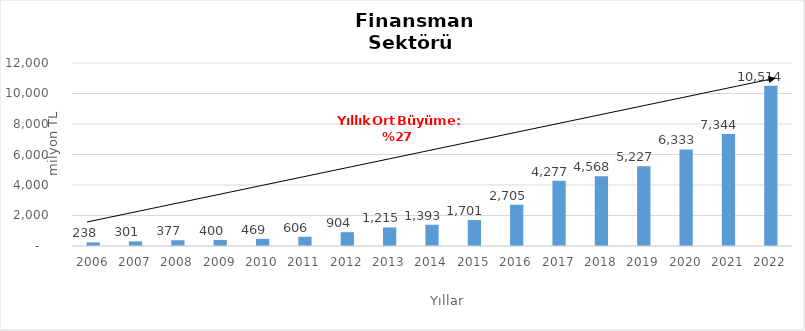
| Category | Finansman |
|---|---|
| 2006.0 | 237.908 |
| 2007.0 | 300.915 |
| 2008.0 | 377.007 |
| 2009.0 | 400.22 |
| 2010.0 | 468.569 |
| 2011.0 | 605.744 |
| 2012.0 | 904.24 |
| 2013.0 | 1214.696 |
| 2014.0 | 1393 |
| 2015.0 | 1701 |
| 2016.0 | 2705 |
| 2017.0 | 4277 |
| 2018.0 | 4568 |
| 2019.0 | 5227 |
| 2020.0 | 6333 |
| 2021.0 | 7344 |
| 2022.0 | 10514 |